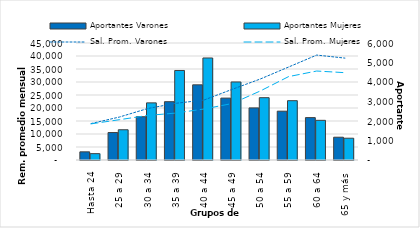
| Category | Aportantes Varones | Aportantes Mujeres |
|---|---|---|
| Hasta 24 | 419 | 326 |
| 25 a 29 | 1408 | 1551 |
| 30 a 34 | 2219 | 2930 |
| 35 a 39 | 2990 | 4591 |
| 40 a 44 | 3855 | 5232 |
| 45 a 49 | 3174 | 4002 |
| 50 a 54 | 2671 | 3196 |
| 55 a 59 | 2504 | 3042 |
| 60 a 64 | 2174 | 2034 |
| 65 y más | 1169 | 1117 |